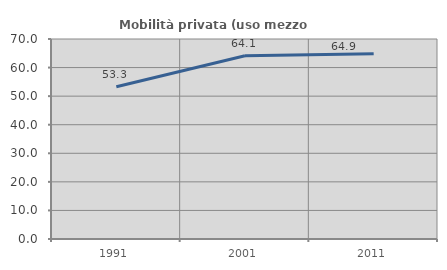
| Category | Mobilità privata (uso mezzo privato) |
|---|---|
| 1991.0 | 53.277 |
| 2001.0 | 64.142 |
| 2011.0 | 64.88 |